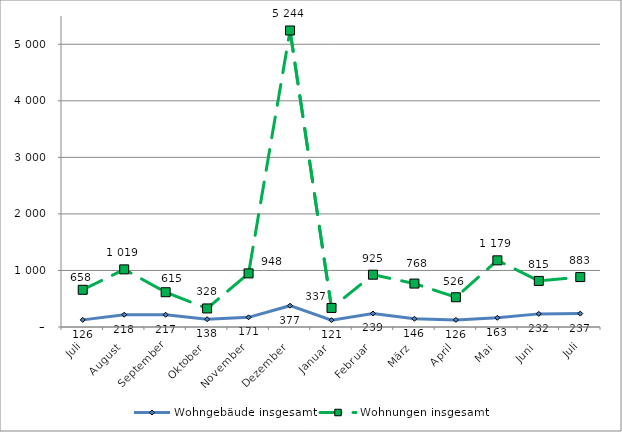
| Category | Wohngebäude insgesamt | Wohnungen insgesamt |
|---|---|---|
| Juli | 126 | 658 |
| August | 218 | 1019 |
| September | 217 | 615 |
| Oktober | 138 | 328 |
| November | 171 | 948 |
| Dezember | 377 | 5244 |
| Januar | 121 | 337 |
| Februar | 239 | 925 |
| März | 146 | 768 |
| April | 126 | 526 |
| Mai | 163 | 1179 |
| Juni | 232 | 815 |
| Juli | 237 | 883 |